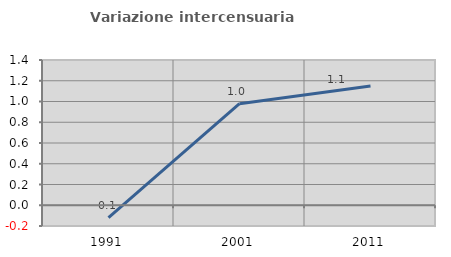
| Category | Variazione intercensuaria annua |
|---|---|
| 1991.0 | -0.118 |
| 2001.0 | 0.979 |
| 2011.0 | 1.149 |